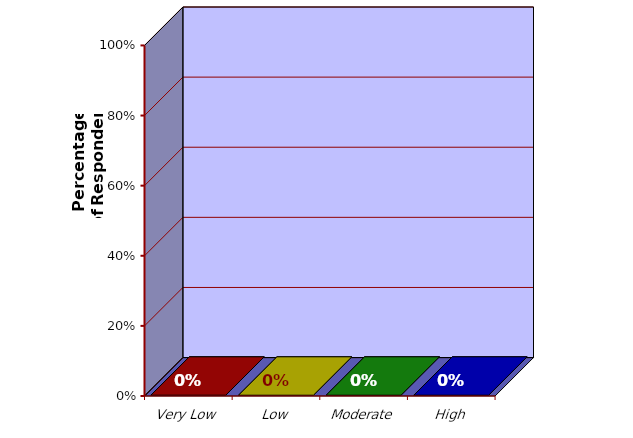
| Category | Series 0 |
|---|---|
| Very Low | 0 |
| Low | 0 |
| Moderate | 0 |
| High | 0 |